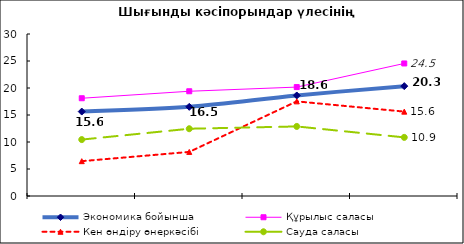
| Category | Экономика бойынша | Құрылыс саласы | Кен өндіру өнеркәсібі | Сауда саласы |
|---|---|---|---|---|
| 0 | 15.637 | 18.103 | 6.452 | 10.448 |
| 1 | 16.511 | 19.397 | 8.163 | 12.457 |
| 2 | 18.615 | 20.168 | 17.526 | 12.881 |
| 3 | 20.345 | 24.545 | 15.625 | 10.855 |